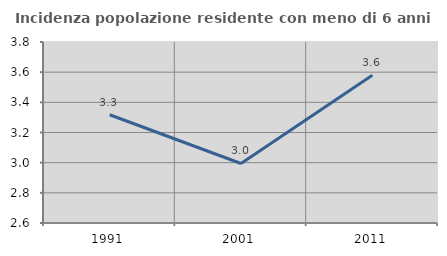
| Category | Incidenza popolazione residente con meno di 6 anni |
|---|---|
| 1991.0 | 3.318 |
| 2001.0 | 2.995 |
| 2011.0 | 3.579 |